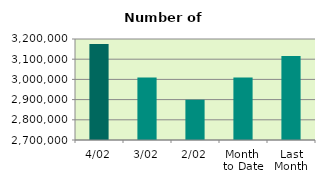
| Category | Series 0 |
|---|---|
| 4/02 | 3175522 |
| 3/02 | 3008804 |
| 2/02 | 2899426 |
| Month 
to Date | 3008989 |
| Last
Month | 3115708.381 |